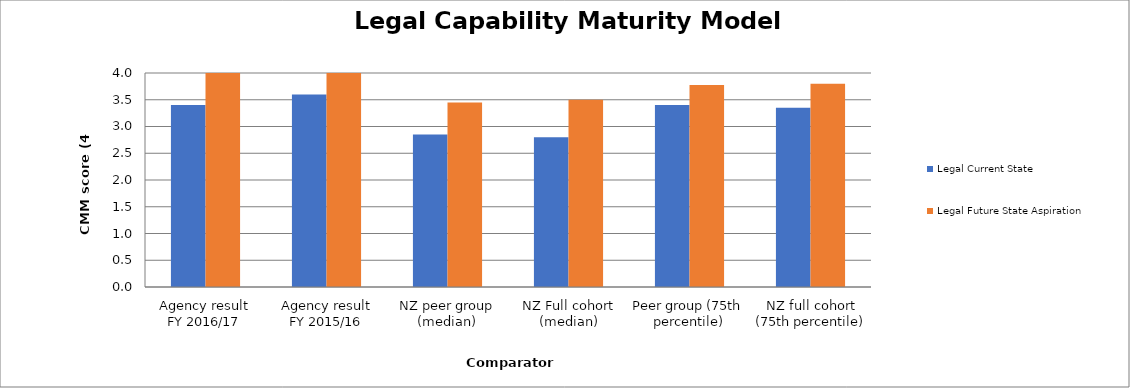
| Category | Legal Current State | Legal Future State Aspiration |
|---|---|---|
| Agency result
FY 2016/17 | 3.4 | 4 |
| Agency result
FY 2015/16 | 3.6 | 4 |
| NZ peer group (median) | 2.85 | 3.45 |
| NZ Full cohort (median) | 2.8 | 3.5 |
| Peer group (75th percentile) | 3.4 | 3.775 |
| NZ full cohort (75th percentile) | 3.35 | 3.8 |